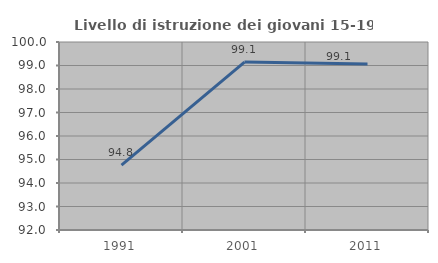
| Category | Livello di istruzione dei giovani 15-19 anni |
|---|---|
| 1991.0 | 94.762 |
| 2001.0 | 99.145 |
| 2011.0 | 99.065 |